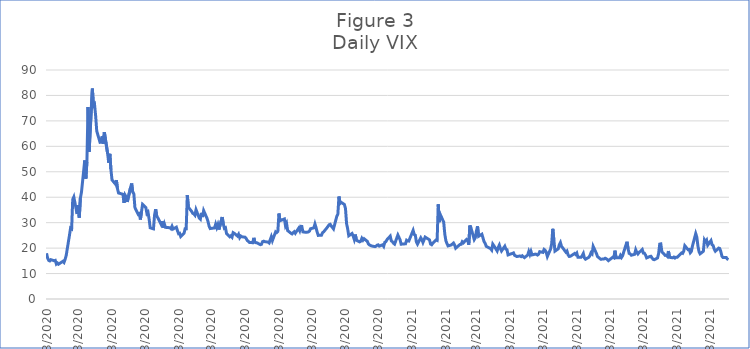
| Category | Series 0 |
|---|---|
| 2/3/20 | 17.97 |
| 2/4/20 | 16.05 |
| 2/5/20 | 15.15 |
| 2/6/20 | 14.96 |
| 2/7/20 | 15.47 |
| 2/10/20 | 15.04 |
| 2/11/20 | 15.18 |
| 2/12/20 | 13.74 |
| 2/13/20 | 14.15 |
| 2/14/20 | 13.68 |
| 2/18/20 | 14.83 |
| 2/19/20 | 14.38 |
| 2/20/20 | 15.56 |
| 2/21/20 | 17.08 |
| 2/24/20 | 25.03 |
| 2/25/20 | 27.85 |
| 2/26/20 | 27.56 |
| 2/27/20 | 39.16 |
| 2/28/20 | 40.11 |
| 3/2/20 | 33.42 |
| 3/3/20 | 36.82 |
| 3/4/20 | 31.99 |
| 3/5/20 | 39.62 |
| 3/6/20 | 41.94 |
| 3/9/20 | 54.46 |
| 3/10/20 | 47.3 |
| 3/11/20 | 53.9 |
| 3/12/20 | 75.47 |
| 3/13/20 | 57.83 |
| 3/16/20 | 82.69 |
| 3/17/20 | 75.91 |
| 3/18/20 | 76.45 |
| 3/19/20 | 72 |
| 3/20/20 | 66.04 |
| 3/23/20 | 61.59 |
| 3/24/20 | 61.67 |
| 3/25/20 | 63.95 |
| 3/26/20 | 61 |
| 3/27/20 | 65.54 |
| 3/30/20 | 57.08 |
| 3/31/20 | 53.54 |
| 4/1/20 | 57.06 |
| 4/2/20 | 50.91 |
| 4/3/20 | 46.8 |
| 4/6/20 | 45.24 |
| 4/7/20 | 46.7 |
| 4/8/20 | 43.35 |
| 4/9/20 | 41.67 |
| 4/13/20 | 41.17 |
| 4/14/20 | 37.76 |
| 4/15/20 | 40.84 |
| 4/16/20 | 40.11 |
| 4/17/20 | 38.15 |
| 4/20/20 | 43.83 |
| 4/21/20 | 45.41 |
| 4/22/20 | 41.98 |
| 4/23/20 | 41.38 |
| 4/24/20 | 35.93 |
| 4/27/20 | 33.29 |
| 4/28/20 | 33.57 |
| 4/29/20 | 31.23 |
| 4/30/20 | 34.15 |
| 5/1/20 | 37.19 |
| 5/4/20 | 35.97 |
| 5/5/20 | 33.61 |
| 5/6/20 | 34.12 |
| 5/7/20 | 31.44 |
| 5/8/20 | 27.98 |
| 5/11/20 | 27.57 |
| 5/12/20 | 33.04 |
| 5/13/20 | 35.28 |
| 5/14/20 | 32.61 |
| 5/15/20 | 31.89 |
| 5/18/20 | 29.3 |
| 5/19/20 | 30.53 |
| 5/20/20 | 27.99 |
| 5/21/20 | 29.53 |
| 5/22/20 | 28.16 |
| 5/26/20 | 28.01 |
| 5/27/20 | 27.62 |
| 5/28/20 | 28.59 |
| 5/29/20 | 27.51 |
| 6/1/20 | 28.23 |
| 6/2/20 | 26.84 |
| 6/3/20 | 25.66 |
| 6/4/20 | 25.81 |
| 6/5/20 | 24.52 |
| 6/8/20 | 25.81 |
| 6/9/20 | 27.57 |
| 6/10/20 | 27.57 |
| 6/11/20 | 40.79 |
| 6/12/20 | 36.09 |
| 6/15/20 | 34.4 |
| 6/16/20 | 33.67 |
| 6/17/20 | 33.47 |
| 6/18/20 | 32.94 |
| 6/19/20 | 35.12 |
| 6/22/20 | 31.77 |
| 6/23/20 | 31.37 |
| 6/24/20 | 33.84 |
| 6/25/20 | 32.22 |
| 6/26/20 | 34.73 |
| 6/29/20 | 31.78 |
| 6/30/20 | 30.43 |
| 7/1/20 | 28.62 |
| 7/2/20 | 27.68 |
| 7/6/20 | 27.94 |
| 7/7/20 | 29.43 |
| 7/8/20 | 28.08 |
| 7/9/20 | 29.26 |
| 7/10/20 | 27.29 |
| 7/13/20 | 32.19 |
| 7/14/20 | 29.52 |
| 7/15/20 | 27.76 |
| 7/16/20 | 28 |
| 7/17/20 | 25.68 |
| 7/20/20 | 24.46 |
| 7/21/20 | 24.84 |
| 7/22/20 | 24.32 |
| 7/23/20 | 26.08 |
| 7/24/20 | 25.84 |
| 7/27/20 | 24.74 |
| 7/28/20 | 25.44 |
| 7/29/20 | 24.1 |
| 7/30/20 | 24.76 |
| 7/31/20 | 24.46 |
| 8/3/20 | 24.28 |
| 8/4/20 | 23.76 |
| 8/5/20 | 22.99 |
| 8/6/20 | 22.65 |
| 8/7/20 | 22.21 |
| 8/10/20 | 22.13 |
| 8/11/20 | 24.03 |
| 8/12/20 | 22.28 |
| 8/13/20 | 22.13 |
| 8/14/20 | 22.05 |
| 8/17/20 | 21.35 |
| 8/18/20 | 21.51 |
| 8/19/20 | 22.54 |
| 8/20/20 | 22.72 |
| 8/21/20 | 22.54 |
| 8/24/20 | 22.37 |
| 8/25/20 | 22.03 |
| 8/26/20 | 23.27 |
| 8/27/20 | 24.47 |
| 8/28/20 | 22.96 |
| 8/31/20 | 26.41 |
| 9/1/20 | 26.12 |
| 9/2/20 | 26.57 |
| 9/3/20 | 33.6 |
| 9/4/20 | 30.75 |
| 9/8/20 | 31.46 |
| 9/9/20 | 28.81 |
| 9/10/20 | 29.71 |
| 9/11/20 | 26.87 |
| 9/14/20 | 25.85 |
| 9/15/20 | 25.59 |
| 9/16/20 | 26.04 |
| 9/17/20 | 26.46 |
| 9/18/20 | 25.83 |
| 9/21/20 | 27.78 |
| 9/22/20 | 26.86 |
| 9/23/20 | 28.58 |
| 9/24/20 | 28.51 |
| 9/25/20 | 26.38 |
| 9/28/20 | 26.19 |
| 9/29/20 | 26.27 |
| 9/30/20 | 26.37 |
| 10/1/20 | 26.7 |
| 10/2/20 | 27.63 |
| 10/5/20 | 27.96 |
| 10/6/20 | 29.48 |
| 10/7/20 | 28.06 |
| 10/8/20 | 26.36 |
| 10/9/20 | 25 |
| 10/12/20 | 25.07 |
| 10/13/20 | 26.07 |
| 10/14/20 | 26.4 |
| 10/15/20 | 26.97 |
| 10/16/20 | 27.41 |
| 10/19/20 | 29.18 |
| 10/20/20 | 29.35 |
| 10/21/20 | 28.65 |
| 10/22/20 | 28.11 |
| 10/23/20 | 27.55 |
| 10/26/20 | 32.46 |
| 10/27/20 | 33.35 |
| 10/28/20 | 40.28 |
| 10/29/20 | 37.59 |
| 10/30/20 | 38.02 |
| 11/2/20 | 37.13 |
| 11/3/20 | 35.55 |
| 11/4/20 | 29.57 |
| 11/5/20 | 27.58 |
| 11/6/20 | 24.86 |
| 11/9/20 | 25.75 |
| 11/10/20 | 24.8 |
| 11/11/20 | 23.45 |
| 11/12/20 | 25.35 |
| 11/13/20 | 23.1 |
| 11/16/20 | 22.45 |
| 11/17/20 | 22.71 |
| 11/18/20 | 23.84 |
| 11/19/20 | 23.11 |
| 11/20/20 | 23.7 |
| 11/23/20 | 22.66 |
| 11/24/20 | 21.64 |
| 11/25/20 | 21.25 |
| 11/27/20 | 20.84 |
| 11/30/20 | 20.57 |
| 12/1/20 | 20.77 |
| 12/2/20 | 21.17 |
| 12/3/20 | 21.28 |
| 12/4/20 | 20.79 |
| 12/7/20 | 21.3 |
| 12/8/20 | 20.68 |
| 12/9/20 | 22.27 |
| 12/10/20 | 22.52 |
| 12/11/20 | 23.31 |
| 12/14/20 | 24.72 |
| 12/15/20 | 22.89 |
| 12/16/20 | 22.5 |
| 12/17/20 | 21.93 |
| 12/18/20 | 21.57 |
| 12/21/20 | 25.16 |
| 12/22/20 | 24.23 |
| 12/23/20 | 23.31 |
| 12/24/20 | 21.53 |
| 12/28/20 | 21.7 |
| 12/29/20 | 23.08 |
| 12/30/20 | 22.77 |
| 12/31/20 | 22.75 |
| 1/4/21 | 26.97 |
| 1/5/21 | 25.34 |
| 1/6/21 | 25.07 |
| 1/7/21 | 22.37 |
| 1/8/21 | 21.56 |
| 1/11/21 | 24.08 |
| 1/12/21 | 23.33 |
| 1/13/21 | 22.21 |
| 1/14/21 | 23.25 |
| 1/15/21 | 24.34 |
| 1/19/21 | 23.24 |
| 1/20/21 | 21.58 |
| 1/21/21 | 21.32 |
| 1/22/21 | 21.91 |
| 1/25/21 | 23.19 |
| 1/26/21 | 23.02 |
| 1/27/21 | 37.21 |
| 1/28/21 | 30.21 |
| 1/29/21 | 33.09 |
| 2/1/21 | 30.24 |
| 2/2/21 | 25.56 |
| 2/3/21 | 22.91 |
| 2/4/21 | 21.77 |
| 2/5/21 | 20.87 |
| 2/8/21 | 21.24 |
| 2/9/21 | 21.63 |
| 2/10/21 | 21.99 |
| 2/11/21 | 21.25 |
| 2/12/21 | 19.97 |
| 2/16/21 | 21.46 |
| 2/17/21 | 21.5 |
| 2/18/21 | 22.49 |
| 2/19/21 | 22.05 |
| 2/22/21 | 23.45 |
| 2/23/21 | 23.11 |
| 2/24/21 | 21.34 |
| 2/25/21 | 28.89 |
| 2/26/21 | 27.95 |
| 3/1/21 | 23.35 |
| 3/2/21 | 24.1 |
| 3/3/21 | 26.67 |
| 3/4/21 | 28.57 |
| 3/5/21 | 24.66 |
| 3/8/21 | 25.47 |
| 3/9/21 | 24.03 |
| 3/10/21 | 22.56 |
| 3/11/21 | 21.91 |
| 3/12/21 | 20.69 |
| 3/15/21 | 20.03 |
| 3/16/21 | 19.79 |
| 3/17/21 | 19.23 |
| 3/18/21 | 21.58 |
| 3/19/21 | 20.95 |
| 3/22/21 | 18.88 |
| 3/23/21 | 20.3 |
| 3/24/21 | 21.2 |
| 3/25/21 | 19.81 |
| 3/26/21 | 18.86 |
| 3/29/21 | 20.74 |
| 3/30/21 | 19.61 |
| 3/31/21 | 19.4 |
| 4/1/21 | 17.33 |
| 4/5/21 | 17.91 |
| 4/6/21 | 18.12 |
| 4/7/21 | 17.16 |
| 4/8/21 | 16.95 |
| 4/9/21 | 16.69 |
| 4/12/21 | 16.91 |
| 4/13/21 | 16.65 |
| 4/14/21 | 16.99 |
| 4/15/21 | 16.57 |
| 4/16/21 | 16.25 |
| 4/19/21 | 17.29 |
| 4/20/21 | 18.68 |
| 4/21/21 | 17.5 |
| 4/22/21 | 18.71 |
| 4/23/21 | 17.33 |
| 4/26/21 | 17.64 |
| 4/27/21 | 17.56 |
| 4/28/21 | 17.28 |
| 4/29/21 | 17.61 |
| 4/30/21 | 18.61 |
| 5/3/21 | 18.31 |
| 5/4/21 | 19.48 |
| 5/5/21 | 19.15 |
| 5/6/21 | 18.39 |
| 5/7/21 | 16.69 |
| 5/10/21 | 19.66 |
| 5/11/21 | 21.84 |
| 5/12/21 | 27.59 |
| 5/13/21 | 23.13 |
| 5/14/21 | 18.81 |
| 5/17/21 | 19.72 |
| 5/18/21 | 21.34 |
| 5/19/21 | 22.18 |
| 5/20/21 | 20.67 |
| 5/21/21 | 20.15 |
| 5/24/21 | 18.4 |
| 5/25/21 | 18.84 |
| 5/26/21 | 17.36 |
| 5/27/21 | 16.74 |
| 5/28/21 | 16.76 |
| 6/1/21 | 17.9 |
| 6/2/21 | 17.48 |
| 6/3/21 | 18.04 |
| 6/4/21 | 16.42 |
| 6/7/21 | 16.42 |
| 6/8/21 | 17.07 |
| 6/9/21 | 17.89 |
| 6/10/21 | 16.1 |
| 6/11/21 | 15.65 |
| 6/14/21 | 16.39 |
| 6/15/21 | 17.02 |
| 6/16/21 | 18.15 |
| 6/17/21 | 17.75 |
| 6/18/21 | 20.7 |
| 6/21/21 | 17.89 |
| 6/22/21 | 16.66 |
| 6/23/21 | 16.32 |
| 6/24/21 | 15.97 |
| 6/25/21 | 15.62 |
| 6/28/21 | 15.76 |
| 6/29/21 | 16.02 |
| 6/30/21 | 15.83 |
| 7/1/21 | 15.48 |
| 7/2/21 | 15.07 |
| 7/6/21 | 16.44 |
| 7/7/21 | 16.2 |
| 7/8/21 | 19 |
| 7/9/21 | 16.18 |
| 7/12/21 | 16.17 |
| 7/13/21 | 17.12 |
| 7/14/21 | 16.33 |
| 7/15/21 | 17.01 |
| 7/16/21 | 18.45 |
| 7/19/21 | 22.5 |
| 7/20/21 | 19.73 |
| 7/21/21 | 17.91 |
| 7/22/21 | 17.69 |
| 7/23/21 | 17.2 |
| 7/26/21 | 17.58 |
| 7/27/21 | 19.36 |
| 7/28/21 | 18.31 |
| 7/29/21 | 17.7 |
| 7/30/21 | 18.24 |
| 8/2/21 | 19.46 |
| 8/3/21 | 18.04 |
| 8/4/21 | 17.97 |
| 8/5/21 | 17.28 |
| 8/6/21 | 16.15 |
| 8/9/21 | 16.72 |
| 8/10/21 | 16.79 |
| 8/11/21 | 16.06 |
| 8/12/21 | 15.59 |
| 8/13/21 | 15.45 |
| 8/16/21 | 16.12 |
| 8/17/21 | 17.91 |
| 8/18/21 | 21.57 |
| 8/19/21 | 21.67 |
| 8/20/21 | 18.56 |
| 8/23/21 | 17.15 |
| 8/24/21 | 17.22 |
| 8/25/21 | 16.79 |
| 8/26/21 | 18.84 |
| 8/27/21 | 16.39 |
| 8/30/21 | 16.19 |
| 8/31/21 | 16.48 |
| 9/1/21 | 16.11 |
| 9/2/21 | 16.41 |
| 9/3/21 | 16.41 |
| 9/7/21 | 18.14 |
| 9/8/21 | 17.96 |
| 9/9/21 | 18.8 |
| 9/10/21 | 20.95 |
| 9/13/21 | 19.37 |
| 9/14/21 | 19.46 |
| 9/15/21 | 18.18 |
| 9/16/21 | 18.69 |
| 9/17/21 | 20.81 |
| 9/20/21 | 25.71 |
| 9/21/21 | 24.36 |
| 9/22/21 | 20.87 |
| 9/23/21 | 18.63 |
| 9/24/21 | 17.75 |
| 9/27/21 | 18.76 |
| 9/28/21 | 23.25 |
| 9/29/21 | 22.56 |
| 9/30/21 | 23.14 |
| 10/1/21 | 21.15 |
| 10/4/21 | 22.96 |
| 10/5/21 | 21.3 |
| 10/6/21 | 21 |
| 10/7/21 | 19.54 |
| 10/8/21 | 18.77 |
| 10/11/21 | 20 |
| 10/12/21 | 19.85 |
| 10/13/21 | 18.64 |
| 10/14/21 | 16.86 |
| 10/15/21 | 16.3 |
| 10/18/21 | 16.31 |
| 10/19/21 | 15.7 |
| 10/20/21 | 15.49 |